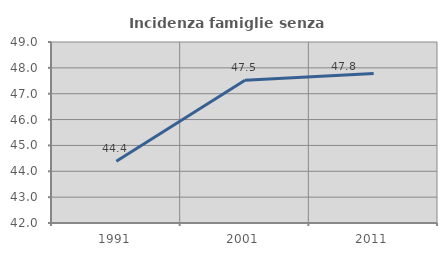
| Category | Incidenza famiglie senza nuclei |
|---|---|
| 1991.0 | 44.385 |
| 2001.0 | 47.525 |
| 2011.0 | 47.778 |